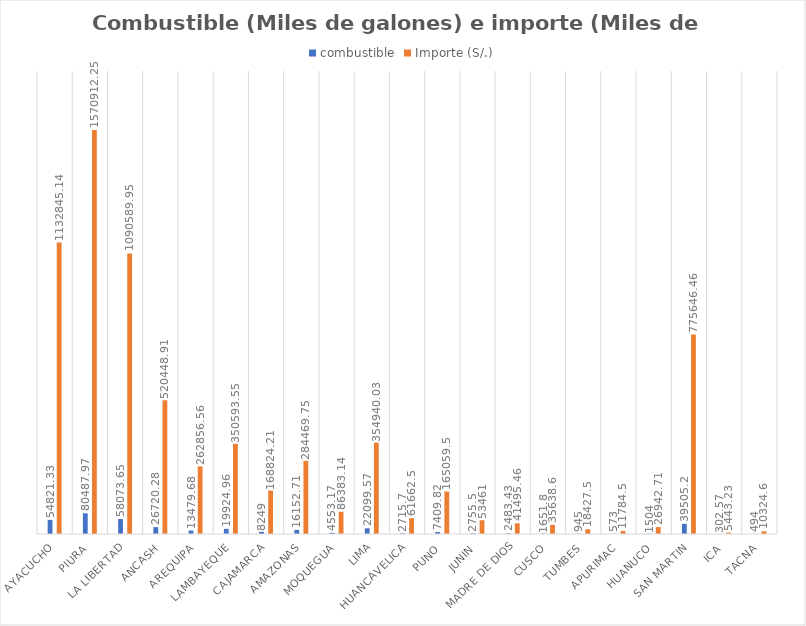
| Category | combustible | Importe (S/.) |
|---|---|---|
| AYACUCHO | 54821.33 | 1132845.14 |
| PIURA | 80487.97 | 1570912.25 |
| LA LIBERTAD | 58073.65 | 1090589.95 |
| ANCASH | 26720.28 | 520448.91 |
| AREQUIPA | 13479.68 | 262856.56 |
| LAMBAYEQUE | 19924.96 | 350593.55 |
| CAJAMARCA | 8249 | 168824.21 |
| AMAZONAS | 16152.71 | 284469.75 |
| MOQUEGUA | 4553.17 | 86383.14 |
| LIMA | 22099.57 | 354940.03 |
| HUANCAVELICA | 2715.7 | 61662.5 |
| PUNO | 7409.82 | 165059.5 |
| JUNIN | 2755.5 | 53461 |
| MADRE DE DIOS | 2483.43 | 41495.46 |
| CUSCO | 1651.8 | 35638.6 |
| TUMBES | 945 | 18427.5 |
| APURIMAC | 573 | 11784.5 |
| HUANUCO | 1504 | 26942.71 |
| SAN MARTIN | 39505.2 | 775646.46 |
| ICA | 302.57 | 5443.23 |
| TACNA | 494 | 10324.6 |